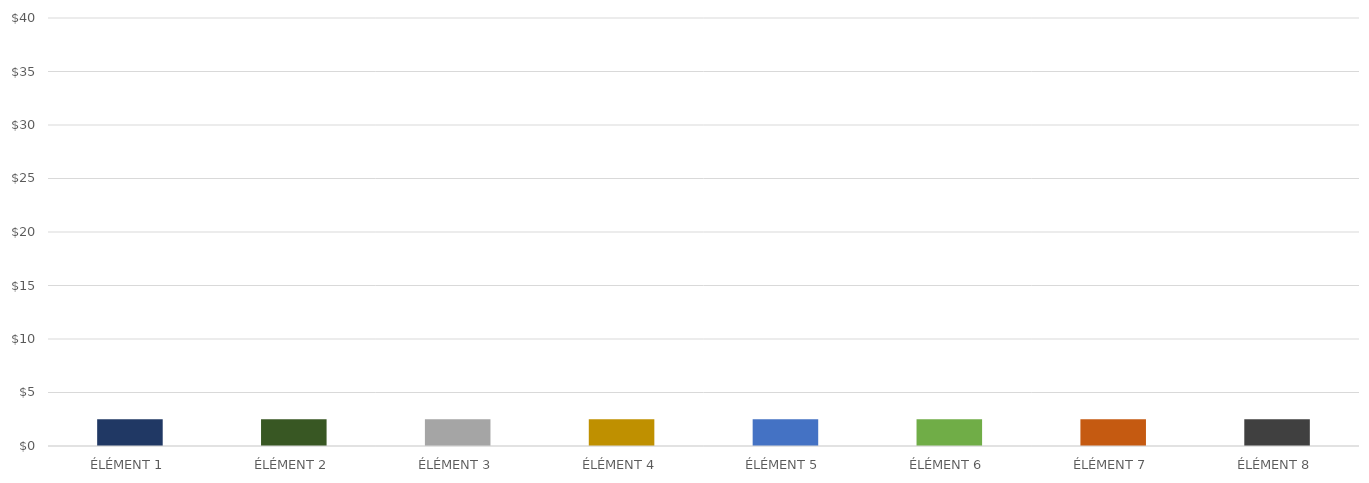
| Category | BÉNÉFICE PAR ÉLÉMENT |
|---|---|
| ÉLÉMENT 1 | 2.5 |
| ÉLÉMENT 2 | 2.5 |
| ÉLÉMENT 3 | 2.5 |
| ÉLÉMENT 4 | 2.5 |
| ÉLÉMENT 5 | 2.5 |
| ÉLÉMENT 6 | 2.5 |
| ÉLÉMENT 7 | 2.5 |
| ÉLÉMENT 8 | 2.5 |